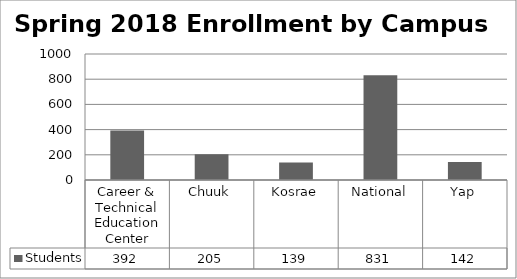
| Category | Students |
|---|---|
| Career & Technical Education Center | 392 |
| Chuuk | 205 |
| Kosrae | 139 |
| National | 831 |
| Yap | 142 |